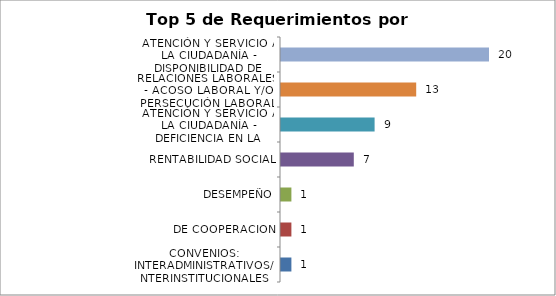
| Category | Total |
|---|---|
| CONVENIOS: INTERADMINISTRATIVOS/INTERINSTITUCIONALES, DE COOPERACION, DESEMPEÑO, RENTABILIDAD SOCIAL | 1 |
| ATENCIÓN Y SERVICIO A LA CIUDADANÍA - DEFICIENCIA EN LA PRESTACIÓN DEL SERVICIO | 1 |
| RELACIONES LABORALES - ACOSO LABORAL Y/O PERSECUCIÓN LABORAL | 1 |
| ATENCIÓN Y SERVICIO A LA CIUDADANÍA - DISPONIBILIDAD DE SERVICIO | 7 |
| INFORMACION INTERNA Y EXTERNA DE LA ENTIDAD  | 9 |
| TRASLADO POR NO COMPETENCIA | 13 |
| TEMAS DE CONTRATACIÓN | 20 |